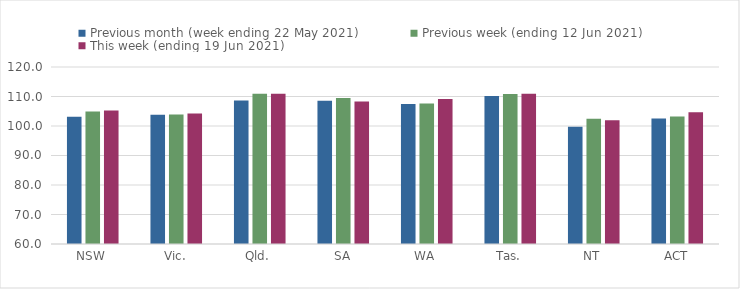
| Category | Previous month (week ending 22 May 2021) | Previous week (ending 12 Jun 2021) | This week (ending 19 Jun 2021) |
|---|---|---|---|
| NSW | 103.13 | 104.94 | 105.22 |
| Vic. | 103.79 | 103.88 | 104.2 |
| Qld. | 108.61 | 110.92 | 110.89 |
| SA | 108.58 | 109.45 | 108.3 |
| WA | 107.43 | 107.64 | 109.16 |
| Tas. | 110.21 | 110.81 | 110.94 |
| NT | 99.73 | 102.5 | 101.94 |
| ACT | 102.54 | 103.25 | 104.63 |